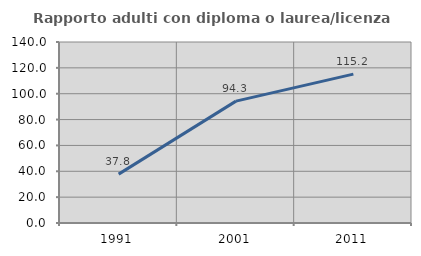
| Category | Rapporto adulti con diploma o laurea/licenza media  |
|---|---|
| 1991.0 | 37.805 |
| 2001.0 | 94.253 |
| 2011.0 | 115.179 |